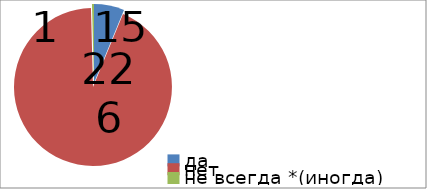
| Category | Series 0 |
|---|---|
| да | 15 |
| нет | 226 |
| не всегда *(иногда) | 1 |